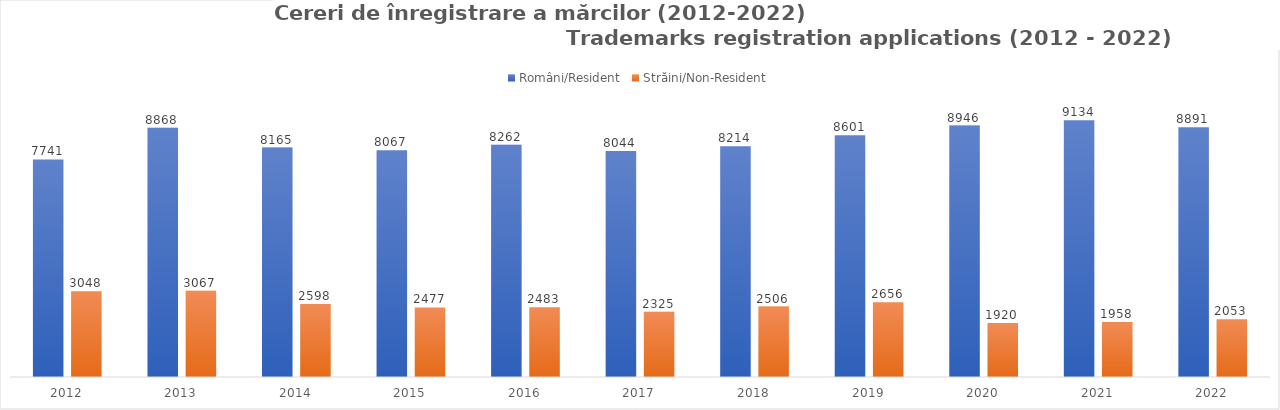
| Category | Români/Resident | Străini/Non-Resident |
|---|---|---|
| 2012.0 | 7741 | 3048 |
| 2013.0 | 8868 | 3067 |
| 2014.0 | 8165 | 2598 |
| 2015.0 | 8067 | 2477 |
| 2016.0 | 8262 | 2483 |
| 2017.0 | 8044 | 2325 |
| 2018.0 | 8214 | 2506 |
| 2019.0 | 8601 | 2656 |
| 2020.0 | 8946 | 1920 |
| 2021.0 | 9134 | 1958 |
| 2022.0 | 8891 | 2053 |